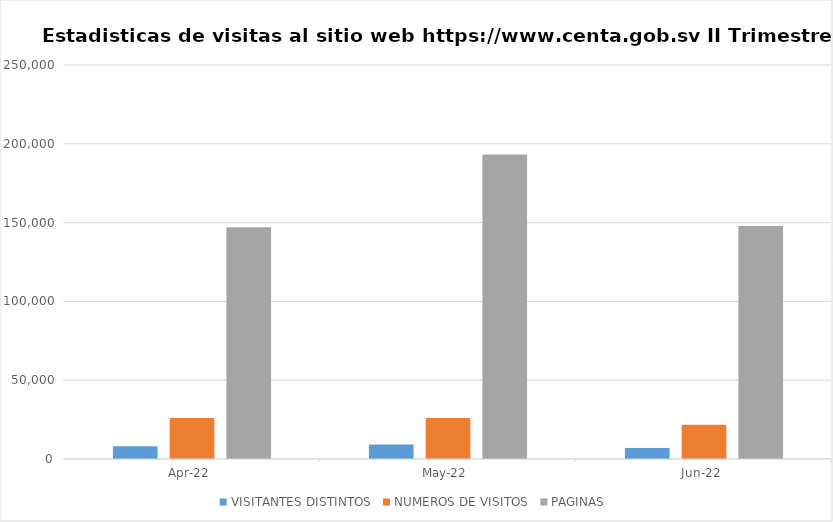
| Category | VISITANTES DISTINTOS  | NUMEROS DE VISITOS  | PAGINAS  |
|---|---|---|---|
| 2022-04-01 | 8077 | 26071 | 147060 |
| 2022-05-01 | 9266 | 25980 | 193181 |
| 2022-06-01 | 7023 | 21771 | 147833 |